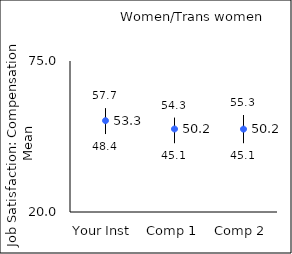
| Category | 25th percentile | 75th percentile | Mean |
|---|---|---|---|
| Your Inst | 48.4 | 57.7 | 53.27 |
| Comp 1 | 45.1 | 54.3 | 50.24 |
| Comp 2 | 45.1 | 55.3 | 50.19 |